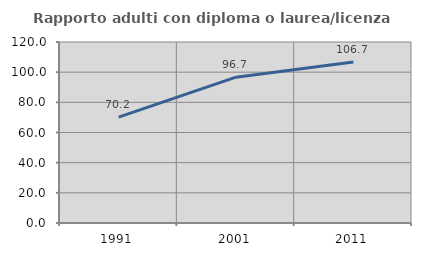
| Category | Rapporto adulti con diploma o laurea/licenza media  |
|---|---|
| 1991.0 | 70.213 |
| 2001.0 | 96.68 |
| 2011.0 | 106.746 |